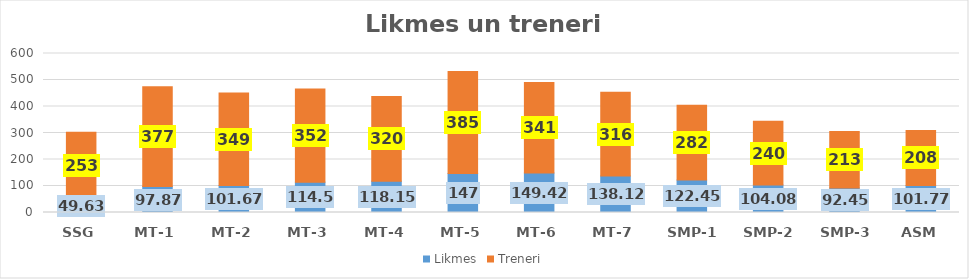
| Category | Likmes | Treneri |
|---|---|---|
| SSG | 49.63 | 253 |
| MT-1 | 97.87 | 377 |
| MT-2 | 101.67 | 349 |
| MT-3 | 114.5 | 352 |
| MT-4 | 118.15 | 320 |
| MT-5 | 147 | 385 |
| MT-6 | 149.42 | 341 |
| MT-7 | 138.12 | 316 |
| SMP-1 | 122.45 | 282 |
| SMP-2 | 104.08 | 240 |
| SMP-3 | 92.45 | 213 |
| ASM | 101.77 | 208 |